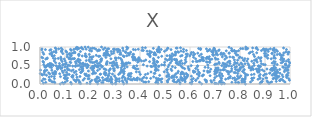
| Category | Series 0 |
|---|---|
| 0.20426082624092745 | 0.587 |
| 0.36272719815670096 | 0.861 |
| 0.8153955051735944 | 0.376 |
| 0.3729846032833899 | 0.445 |
| 0.8045086489264134 | 0.567 |
| 0.1439994279631579 | 0.341 |
| 0.8717027761930042 | 0.317 |
| 0.9951669443724769 | 0.857 |
| 0.8722146589589249 | 0.127 |
| 0.8231444333154888 | 0.943 |
| 0.8858583309482669 | 0.904 |
| 0.6836288513205269 | 0.089 |
| 0.6956370302324736 | 0.103 |
| 0.9128229049434629 | 0.879 |
| 0.7866731166661785 | 0.125 |
| 0.9286679426933921 | 0.833 |
| 0.03636047862152203 | 0.187 |
| 0.9949222020885375 | 0.144 |
| 0.10073876753924604 | 0.049 |
| 0.6173904949461092 | 0.331 |
| 0.9361999415781771 | 0.388 |
| 0.4546234243039249 | 0.195 |
| 0.7942854840604906 | 0.901 |
| 0.453441863623966 | 0.963 |
| 0.7034644494690323 | 0.384 |
| 0.08862146865692822 | 0.443 |
| 0.8657607751653718 | 0.671 |
| 0.1778056656379653 | 0.147 |
| 0.9908134551769016 | 0.229 |
| 0.5734910125883016 | 0.297 |
| 0.025885028320127956 | 0.237 |
| 0.18910464906426017 | 0.53 |
| 0.058720695203867024 | 0.268 |
| 0.9988391513887683 | 0.568 |
| 0.7531435049663163 | 0.313 |
| 0.5453642049344821 | 0.048 |
| 0.28661217034137265 | 0.567 |
| 0.6293666507666607 | 0.468 |
| 0.10953422019362935 | 0.788 |
| 0.736399254082159 | 0.455 |
| 0.6689070766604224 | 0.723 |
| 0.877908004540325 | 0.466 |
| 0.13989807700627843 | 0.843 |
| 0.8034697403553471 | 0.219 |
| 0.3613317264856879 | 0.119 |
| 0.2716113823469338 | 0.8 |
| 0.7772426047332179 | 0.908 |
| 0.230289860706544 | 0.364 |
| 0.9858885750368827 | 0.618 |
| 0.6006705914541699 | 0.023 |
| 0.8167280837820041 | 0.046 |
| 0.8890980154758239 | 0.381 |
| 0.8224665428520189 | 0.242 |
| 0.7261052932751103 | 0.146 |
| 0.9211750492984048 | 0.039 |
| 0.864371083432124 | 0.965 |
| 0.5536000208553401 | 0.111 |
| 0.766303091895723 | 0.477 |
| 0.2071403551075638 | 0.1 |
| 0.5785187022987416 | 0.197 |
| 0.5291774522851926 | 0.212 |
| 0.2635962169169568 | 0.782 |
| 0.9821509240772714 | 0.537 |
| 0.8086825867615756 | 0.53 |
| 0.8102758712557877 | 0.34 |
| 0.7366243455381281 | 0.529 |
| 0.2531722291397108 | 0.937 |
| 0.26981595716468465 | 0.948 |
| 0.5078422854178415 | 0.389 |
| 0.11728472437353166 | 0.38 |
| 0.2694240173599839 | 0.783 |
| 0.5298944465102073 | 0.179 |
| 0.2382102585453839 | 0.093 |
| 0.62244907969625 | 0.68 |
| 0.8028624765664213 | 0.956 |
| 0.9379420180453679 | 0.263 |
| 0.0810122083528747 | 0.002 |
| 0.9404600337599457 | 0.335 |
| 0.9440288562619685 | 0.248 |
| 0.18918474456399714 | 0.213 |
| 0.18152301695239692 | 0.814 |
| 0.5511701843380219 | 0.303 |
| 0.16602953981180335 | 0.97 |
| 0.7138296633233044 | 0.395 |
| 0.38416116291410807 | 0.404 |
| 0.5119570314778064 | 0.965 |
| 0.3589990521461809 | 0.819 |
| 0.02248040734097445 | 0.455 |
| 0.782787944527805 | 0.043 |
| 0.17037306247257478 | 0.416 |
| 0.32302890541042795 | 0.322 |
| 0.6132757652107951 | 0.149 |
| 0.7671430962477555 | 0.901 |
| 0.9367349539748241 | 0.771 |
| 0.328903918637116 | 0.6 |
| 0.9390570919229485 | 0.277 |
| 0.21121281889740506 | 0.579 |
| 0.6972482574754387 | 0.96 |
| 0.6987492200506394 | 0.335 |
| 0.5778197350301918 | 0.147 |
| 0.08457363760785963 | 0.652 |
| 0.0020432830335050944 | 0.375 |
| 0.739401217180128 | 0.544 |
| 0.4543857058536014 | 0.644 |
| 0.29387802545341835 | 0.583 |
| 0.16861424153614768 | 0.389 |
| 0.9874000073999551 | 0.253 |
| 0.5203910463553771 | 0.736 |
| 0.9450880229823172 | 0.916 |
| 0.09135840629216607 | 0.823 |
| 0.16371353473478523 | 0.45 |
| 0.44625596999551886 | 0.86 |
| 0.8379488037062102 | 0.445 |
| 0.36660160080648796 | 0.117 |
| 0.05054124931553772 | 0.519 |
| 0.07004184901843591 | 0.396 |
| 0.3984714322417813 | 0.13 |
| 0.05286585466638882 | 0.275 |
| 0.24626442548236527 | 0.684 |
| 0.03230455443888447 | 0.489 |
| 0.5070130685234417 | 0.379 |
| 0.7931853362486412 | 0.045 |
| 0.42846662173983563 | 0.483 |
| 0.4863749598631587 | 0.053 |
| 0.6345063372000457 | 0.961 |
| 0.6495537378866599 | 0.221 |
| 0.8796642263016647 | 0.15 |
| 0.7391998202623412 | 0.389 |
| 0.2973303675122261 | 0.549 |
| 0.10321127724795764 | 0.542 |
| 0.029147267083311723 | 0.507 |
| 0.08491017508891441 | 0.682 |
| 0.4718970721325203 | 0.018 |
| 0.34049405195712357 | 0.118 |
| 0.0896864574170767 | 0.035 |
| 0.5268406468337656 | 0.736 |
| 0.4384137567321579 | 0.828 |
| 0.6467300893166146 | 0.004 |
| 0.4402103204520892 | 0.764 |
| 0.0012947371169115263 | 0.281 |
| 0.7375912445183042 | 0.011 |
| 0.881381449106707 | 0.684 |
| 0.9009874083989451 | 0.931 |
| 0.8368346616231039 | 0.83 |
| 0.13261716964793768 | 0.38 |
| 0.6714969211813043 | 0.314 |
| 0.9345429772264244 | 0.278 |
| 0.9917687338457789 | 0.449 |
| 0.23528196132088064 | 0.493 |
| 0.04596977145695347 | 0.441 |
| 0.1025078431906482 | 0.215 |
| 0.46363222152208994 | 0.785 |
| 0.45744265631101555 | 0.806 |
| 0.47564024752365486 | 0.897 |
| 0.2875647804557574 | 0.127 |
| 0.9486080406341058 | 0.796 |
| 0.2306459618919119 | 0.007 |
| 0.08520337376985399 | 0.429 |
| 0.7167963672757596 | 0.554 |
| 0.9510649353961637 | 0.311 |
| 0.1480542360676662 | 0.182 |
| 0.4215163813903171 | 0.979 |
| 0.40119820566899056 | 0.26 |
| 0.3168165262415932 | 0.141 |
| 0.7139972592213552 | 0.902 |
| 0.6062332316873058 | 0.119 |
| 0.2650329611128587 | 0.899 |
| 0.7885413541185451 | 0.375 |
| 0.51032174629952 | 0.05 |
| 0.05764543697486646 | 0.146 |
| 0.39311373453499665 | 0.652 |
| 0.5815192118134738 | 0.654 |
| 0.1721933965001573 | 0.565 |
| 0.438152989882832 | 0.809 |
| 0.182704542981746 | 0.754 |
| 0.1565620977351455 | 0.796 |
| 0.7166259490193165 | 0.92 |
| 0.19839203905748337 | 0.617 |
| 0.4785693153477907 | 0.234 |
| 0.21443484136136948 | 0.454 |
| 0.938091676849601 | 0.396 |
| 0.04492601517536854 | 0.49 |
| 0.23865719245895756 | 0.912 |
| 0.8077638655480437 | 0.045 |
| 0.9392154291078335 | 0.233 |
| 0.13203354356826114 | 0.837 |
| 0.9680639251904615 | 0.123 |
| 0.9307343503792886 | 0.416 |
| 0.5241613252941968 | 0.402 |
| 0.680394147234449 | 0.224 |
| 0.8210393994593771 | 0.138 |
| 0.11080782466738104 | 0.387 |
| 0.3227594535843141 | 0.688 |
| 0.4868497504389193 | 0.749 |
| 0.32727324132181057 | 0.645 |
| 0.028985612871642363 | 0.704 |
| 0.16918695758305713 | 0.547 |
| 0.19706647920278675 | 0.799 |
| 0.08908796911676908 | 0.355 |
| 0.21254556123435586 | 0.74 |
| 0.12583671574990285 | 0.004 |
| 0.6788178619125795 | 0.333 |
| 0.23004643392242385 | 0.897 |
| 0.42809470955344475 | 0.888 |
| 0.8079894780572482 | 0.706 |
| 0.08929886844066193 | 0.934 |
| 0.9349350752687714 | 0.409 |
| 0.057265236243856155 | 0.766 |
| 0.9657609768777229 | 0.769 |
| 0.9729835945534653 | 0.781 |
| 0.22138345916885083 | 0.509 |
| 0.9108135810169176 | 0.052 |
| 0.7571453855427139 | 0.838 |
| 0.6559080299571 | 0.353 |
| 0.2813214126635343 | 0.411 |
| 0.16292038187066993 | 0.55 |
| 0.3694038933034278 | 0.111 |
| 0.7820069659544412 | 0.307 |
| 0.3353505026928243 | 0.53 |
| 0.37665727184385667 | 0.442 |
| 0.192959501167844 | 0.996 |
| 0.45657888795504553 | 0.611 |
| 0.3558701874518294 | 0.78 |
| 0.43123808488022775 | 0.28 |
| 0.08494730590054211 | 0.966 |
| 0.7706854030230755 | 0.723 |
| 0.42359506835227 | 0.05 |
| 0.08677458988044096 | 0.885 |
| 0.6676205136406256 | 0.713 |
| 0.5682508094975662 | 0.279 |
| 0.4699746184392396 | 0.598 |
| 0.6510035724255978 | 0.237 |
| 0.6057660741158809 | 0.851 |
| 0.936171208440344 | 0.488 |
| 0.9362556265692535 | 0.725 |
| 0.18558498391098854 | 0.747 |
| 0.12310515082170304 | 0.041 |
| 0.9394032443868113 | 0.856 |
| 0.9799674906378966 | 0.053 |
| 0.09842973614849981 | 0.161 |
| 0.2620089055709266 | 0.243 |
| 0.3751388929189067 | 0.481 |
| 0.508905180460514 | 0.085 |
| 0.18023294945812696 | 0.998 |
| 0.0499399534771201 | 0.751 |
| 0.3791380045854198 | 0.428 |
| 0.8734251827224896 | 0.484 |
| 0.5286984664390291 | 0.817 |
| 0.3082544406471913 | 0.13 |
| 0.9920679058266617 | 0.376 |
| 0.47497004385624664 | 0.994 |
| 0.3931199917037339 | 0.637 |
| 0.8668659235164714 | 0.843 |
| 0.8807666132165727 | 0.257 |
| 0.896425141647479 | 0.348 |
| 0.5113057417087165 | 0.096 |
| 0.5768870990509087 | 0.254 |
| 0.3419639466383011 | 0.558 |
| 0.5740138712299341 | 0.938 |
| 0.28448377411414394 | 0.878 |
| 0.3215787679280594 | 0.857 |
| 0.6371489536631865 | 0.631 |
| 0.32032923089676835 | 0.291 |
| 0.3405001858084 | 0.159 |
| 0.7319695607502713 | 0.564 |
| 0.5898686009530584 | 0.808 |
| 0.8832583714800242 | 0.62 |
| 0.3249566990516528 | 0.44 |
| 0.6655981573459808 | 0.093 |
| 0.9858304780624292 | 0.931 |
| 0.37993536864136357 | 0.115 |
| 0.22609160054632638 | 0.15 |
| 0.7711022381137624 | 0.153 |
| 0.6358103167709765 | 0.244 |
| 0.19824517738709824 | 0.908 |
| 0.10084685162209162 | 0.534 |
| 0.09990840605668316 | 0.467 |
| 0.6773573168856797 | 0.738 |
| 0.47472515713985886 | 0.099 |
| 0.011555716567567487 | 0.851 |
| 0.8660408566263198 | 0.984 |
| 0.9054767166310111 | 0.267 |
| 0.474117920409582 | 0.47 |
| 0.5683517901357025 | 0.771 |
| 0.32897169378199675 | 0.089 |
| 0.49724025372833813 | 0.517 |
| 0.45927880822789524 | 0.837 |
| 0.15998571553792695 | 0.204 |
| 0.7593739829180958 | 0.327 |
| 0.09708007251631345 | 0.677 |
| 0.7043491643790238 | 0.875 |
| 0.01748928820958795 | 0.265 |
| 0.29000004685441627 | 0.269 |
| 0.018456488234017354 | 0.355 |
| 0.20981636368183498 | 0.967 |
| 0.2710284507711629 | 0.161 |
| 0.2248992576885056 | 0.775 |
| 0.9424847011516664 | 0.158 |
| 0.3011384706428917 | 0.016 |
| 0.184593329495772 | 0.73 |
| 0.9687647168473578 | 0.694 |
| 0.023065317334067137 | 0.042 |
| 0.2521463105255711 | 0.03 |
| 0.24326686488832716 | 0.607 |
| 0.969267750650562 | 0.584 |
| 0.3945448865820159 | 0.615 |
| 0.12859558118037273 | 0.686 |
| 0.6346397889964022 | 0.324 |
| 0.01417654244990263 | 0.138 |
| 0.8168713114256172 | 0.392 |
| 0.7596252316662185 | 0.733 |
| 0.583197099466221 | 0.712 |
| 0.15420562381909142 | 0.8 |
| 0.5393932711820336 | 0.664 |
| 0.535807597800587 | 0.119 |
| 0.908453877123066 | 0.083 |
| 0.7889481639450913 | 0.566 |
| 0.7594488594356501 | 0.613 |
| 0.04619025106576036 | 0.206 |
| 0.44734471452241786 | 0.469 |
| 0.21665004354538941 | 0.291 |
| 0.46330757036101566 | 0.514 |
| 0.23510525273766514 | 0.17 |
| 0.9062308233953231 | 0.938 |
| 0.4214046086001928 | 0.255 |
| 0.6055044209759267 | 0.21 |
| 0.3036657669856002 | 0.646 |
| 0.1585959470023366 | 0.063 |
| 0.9560370313628218 | 0.205 |
| 0.7063644272372702 | 0.834 |
| 0.28397215981434165 | 0.127 |
| 0.4980253947897627 | 0.884 |
| 0.046613365895329606 | 0.853 |
| 0.02822613965028542 | 0.686 |
| 0.26868108972213234 | 0.092 |
| 0.9962703725989592 | 0.502 |
| 0.0200896544636755 | 0.455 |
| 0.8504853275505116 | 0.974 |
| 0.3465654816147046 | 0.076 |
| 0.9007436654336358 | 0.52 |
| 0.5296526280565605 | 0.469 |
| 0.2570990968569683 | 0.827 |
| 0.7551997729883904 | 0.168 |
| 0.051347332949236546 | 0.055 |
| 0.841455578038374 | 0.855 |
| 0.7802712066780634 | 0.451 |
| 0.13700470372356666 | 0.313 |
| 0.4636971860242297 | 0.512 |
| 0.2302775628659215 | 0.55 |
| 0.06256094666790346 | 0.575 |
| 0.014198430732694445 | 0.59 |
| 0.26866485867571865 | 0.858 |
| 0.9588104168219957 | 0.797 |
| 0.7272049085964322 | 0.002 |
| 0.2061544478597367 | 0.891 |
| 0.5695257522095508 | 0.553 |
| 0.4684814404825458 | 0.929 |
| 0.676253433226015 | 0.327 |
| 0.14466272177499684 | 0.558 |
| 0.5927035661395808 | 0.464 |
| 0.704407459936592 | 0.4 |
| 0.456981484186502 | 0.652 |
| 0.3159990297996561 | 0.915 |
| 0.6809002965666019 | 0.656 |
| 0.43840382563686775 | 0.604 |
| 0.22588481077879086 | 0.063 |
| 0.8459373146967529 | 0.252 |
| 0.30604041466172127 | 0.57 |
| 0.4560899790039462 | 0.484 |
| 0.07936626503724276 | 0.466 |
| 0.27755853285971044 | 0.288 |
| 0.24707490026591095 | 0.033 |
| 0.6065989490808291 | 0.008 |
| 0.711970872658111 | 0.437 |
| 0.9744610470010434 | 0.615 |
| 0.6307761761957774 | 0.61 |
| 0.19988545812393732 | 0.723 |
| 0.4646963885246441 | 0.158 |
| 0.14191714509666276 | 0.475 |
| 0.6478444516582659 | 0.713 |
| 0.15376117158035918 | 0.673 |
| 0.3335747542528341 | 0.198 |
| 0.27826512195578756 | 0.767 |
| 0.1089263109806351 | 0.087 |
| 0.29980645831950303 | 0.513 |
| 0.3325880177130224 | 0.047 |
| 0.8728499791190857 | 0.411 |
| 0.5103835539593453 | 0.967 |
| 0.10969764513665536 | 0.424 |
| 0.5844428979394815 | 0.809 |
| 0.640864908199048 | 0.637 |
| 0.0568935914425055 | 0.201 |
| 0.1553204743909501 | 0.961 |
| 0.25229424011980706 | 0.095 |
| 0.4306753909956903 | 0.809 |
| 0.4712468769461454 | 0.925 |
| 0.4436246937371704 | 0.478 |
| 0.8318467751030398 | 0.551 |
| 0.3939248193291073 | 0.685 |
| 0.3518711287475502 | 0.147 |
| 0.006466064222615753 | 0.924 |
| 0.48481180038158467 | 0.933 |
| 0.924830814015153 | 0.682 |
| 0.279748951341237 | 0.567 |
| 0.37431770316361745 | 0.804 |
| 0.7840422815550983 | 0.557 |
| 0.9443461906131343 | 0.313 |
| 0.8757161610599139 | 0.492 |
| 0.3470099173156461 | 0.764 |
| 0.679375428741443 | 0.933 |
| 0.5472866330707112 | 0.561 |
| 0.18481765726021337 | 0.267 |
| 0.31463823791160084 | 0.919 |
| 0.024562395591210873 | 0.476 |
| 0.8845072735510909 | 0.04 |
| 0.9937405560151178 | 0.658 |
| 0.33488732583611447 | 0.003 |
| 0.7473145273250765 | 0.346 |
| 0.05457578435853205 | 0.292 |
| 0.26365798267513185 | 0.718 |
| 0.8013608610128926 | 0.445 |
| 0.3515563889180784 | 0.976 |
| 0.5370285449091395 | 0.665 |
| 0.9597704210461385 | 0.09 |
| 0.7660287465224299 | 0.958 |
| 0.07337214603317643 | 0.469 |
| 0.20146993101728994 | 0.063 |
| 0.6657694304707963 | 0.95 |
| 0.09477180252355033 | 0.009 |
| 0.10936004980919278 | 0.469 |
| 0.8996808543108922 | 0.261 |
| 0.19243963995071178 | 0.138 |
| 0.695457769021146 | 0.967 |
| 0.09226628915792545 | 0.528 |
| 0.9035800635301651 | 0.166 |
| 0.5673697573140551 | 0.312 |
| 0.7251167387082349 | 0.836 |
| 0.7939297808261351 | 0.347 |
| 0.8228926372969217 | 0.264 |
| 0.17120805811038198 | 0.358 |
| 0.5411476880764686 | 0.443 |
| 0.6227105871434386 | 0.42 |
| 0.9066416683210102 | 0.163 |
| 0.4203303210976038 | 0.05 |
| 0.06442364142364798 | 0.949 |
| 0.039709650400051144 | 0.461 |
| 0.015095522348089085 | 0.806 |
| 0.47003341552970834 | 0.884 |
| 0.6992594932943975 | 0.169 |
| 0.06327339114669106 | 0.326 |
| 0.8489284193497505 | 0.46 |
| 0.5622545279779477 | 0.501 |
| 0.03956609611094708 | 0.814 |
| 0.08862704645607045 | 0.607 |
| 0.9877208054636859 | 0.366 |
| 0.10461721826170534 | 0.571 |
| 0.6309308755530739 | 0.155 |
| 0.8307557445307142 | 0.962 |
| 0.16261878458571755 | 0.012 |
| 0.8163658370627587 | 0.305 |
| 0.2444609856516442 | 0.659 |
| 0.5241531355454992 | 0.93 |
| 0.6522127907961502 | 0.632 |
| 0.5806394510945289 | 0.059 |
| 0.9709307784704868 | 0.638 |
| 0.3033758138181287 | 0.003 |
| 0.1879722278568593 | 0.022 |
| 0.693427982916604 | 0.788 |
| 0.1308535162450104 | 0.482 |
| 0.013555015750910893 | 0.023 |
| 0.13812422824341086 | 0.867 |
| 0.5718445090263268 | 0.436 |
| 0.4766020361574057 | 0.94 |
| 0.061018017841993344 | 0.684 |
| 0.5437429590511504 | 0.276 |
| 0.6303100749555192 | 0.494 |
| 0.932441615161987 | 0.141 |
| 0.19632354208822012 | 0.656 |
| 0.4557711734934117 | 0.797 |
| 0.8765001430850708 | 0.217 |
| 0.9220824252134225 | 0.388 |
| 0.8309268377944239 | 0.245 |
| 0.6189112443693658 | 0.808 |
| 0.8474847007029305 | 0.151 |
| 0.5197954411267353 | 0.683 |
| 0.703966373760818 | 0.8 |
| 0.8565176419515373 | 0.265 |
| 0.15540300142060415 | 0.767 |
| 0.5469065270417945 | 0.624 |
| 0.06410192118651614 | 0.895 |
| 0.1325084659663236 | 0.219 |
| 0.46140048383209087 | 0.371 |
| 0.9904694796470415 | 0.384 |
| 0.4601088098833448 | 0.822 |
| 0.31082777348556867 | 0.867 |
| 0.30522770109259345 | 0.931 |
| 0.5639885568159662 | 0.889 |
| 0.08196503792780874 | 0.199 |
| 0.7043358968642804 | 0.013 |
| 0.14392300581092432 | 0.066 |
| 0.1820501945670675 | 0.496 |
| 0.7442497529413366 | 0.47 |
| 0.2657996756755838 | 0.105 |
| 0.9748557956643837 | 0.45 |
| 0.3468507598189753 | 0.996 |
| 0.7518277660546295 | 0.34 |
| 0.3733791252779325 | 0.934 |
| 0.7596161101037795 | 0.166 |
| 0.216819633199405 | 0.489 |
| 0.8743898490281056 | 0.716 |
| 0.3475299151544078 | 0.938 |
| 0.5786745976359775 | 0.557 |
| 0.7995920887262412 | 0.412 |
| 0.5086908102517066 | 0.383 |
| 0.6377136803622551 | 0.762 |
| 0.3273101474759377 | 0.553 |
| 0.578369958767724 | 0.121 |
| 0.9978527813160033 | 0.103 |
| 0.8216189022833787 | 0.189 |
| 0.6644832022630008 | 0.07 |
| 0.11719053958002346 | 0.708 |
| 0.26371199796718403 | 0.809 |
| 0.4231575953461152 | 0.648 |
| 0.3317082478898482 | 0.559 |
| 0.7991002491088242 | 0.729 |
| 0.540340299803426 | 0.792 |
| 0.7791659855876351 | 0.887 |
| 0.37680578951271015 | 0.681 |
| 0.20970252308538895 | 0.382 |
| 0.9644936253385915 | 0.572 |
| 0.8940855577504401 | 0.23 |
| 0.2464452301443799 | 0.459 |
| 0.8800145659117736 | 0.172 |
| 0.8863882881664555 | 0.05 |
| 0.858136655588451 | 0.743 |
| 0.515561201348522 | 0.515 |
| 0.46208719475433624 | 0.398 |
| 0.11688905705376784 | 0.812 |
| 0.3325286879307279 | 0.214 |
| 0.5787859669699013 | 0.101 |
| 0.9438361841556673 | 0.292 |
| 0.8855302659861458 | 0.549 |
| 0.8230325743517664 | 0.997 |
| 0.5623941543970058 | 0.754 |
| 0.5381870438767254 | 0.235 |
| 0.16601018328046813 | 0.989 |
| 0.2861278523852011 | 0.041 |
| 0.347224759055487 | 0.025 |
| 0.9496916603126861 | 0.884 |
| 0.2338359172759905 | 0.911 |
| 0.6906283120137467 | 0.799 |
| 0.12482016883495273 | 0.908 |
| 0.6702615923053019 | 0.35 |
| 0.9215143747658617 | 0.952 |
| 0.16165853020287324 | 0.877 |
| 0.2981756702372724 | 0.216 |
| 0.5258080050787739 | 0.177 |
| 0.670639018293984 | 0.698 |
| 0.05711004528162611 | 0.625 |
| 0.6249462732934612 | 0.608 |
| 0.9277943046694374 | 0.823 |
| 0.04684155325518613 | 0.518 |
| 0.12546514899693695 | 0.818 |
| 0.27485098894532 | 0.228 |
| 0.9110434401165222 | 0.696 |
| 0.9658451906472248 | 0.763 |
| 0.5903723064027617 | 0.221 |
| 0.09780854229775937 | 0.157 |
| 0.35324338288235635 | 0.574 |
| 0.6136469464313995 | 0.777 |
| 0.8522106534557611 | 0.4 |
| 0.23178407233084763 | 0.068 |
| 0.062078195785852164 | 0.273 |
| 0.7776672172081883 | 0.652 |
| 0.9790957057770394 | 0.376 |
| 0.6199787495047786 | 0.331 |
| 0.3363776126302538 | 0.741 |
| 0.5602186744030209 | 0.032 |
| 0.21441903279053454 | 0.349 |
| 0.6928894395682054 | 0.915 |
| 0.3066063283917877 | 0.507 |
| 0.8564555479283187 | 0.502 |
| 0.14271971840745834 | 0.958 |
| 0.07936999717300341 | 0.494 |
| 0.4134288063584255 | 0.521 |
| 0.5269543590460509 | 0.672 |
| 0.9851167176779961 | 0.507 |
| 0.13513834317303774 | 0.935 |
| 0.6992384554127247 | 0.015 |
| 0.2938205515513278 | 0.414 |
| 0.18454819231425668 | 0.942 |
| 0.04720174210735861 | 0.373 |
| 0.5620601587052249 | 0.978 |
| 0.09099548313332517 | 0.515 |
| 0.037659121539717844 | 0.116 |
| 0.1492831120470246 | 0.936 |
| 0.9602808886553285 | 0.289 |
| 0.7177175734723504 | 0.241 |
| 0.4158924407639356 | 0.621 |
| 0.6500866711725475 | 0.665 |
| 0.9448635423404214 | 0.13 |
| 0.9504226911084956 | 0.174 |
| 0.7038267954854284 | 0.669 |
| 0.18510474791884546 | 0.632 |
| 0.7188072095131992 | 0.068 |
| 0.3146516776298385 | 0.707 |
| 0.8939435389429804 | 0.943 |
| 0.7982702263489648 | 0.179 |
| 0.36487128423113924 | 0.285 |
| 0.8554831600917963 | 0.166 |
| 0.6310217869644013 | 0.383 |
| 0.8129143513113731 | 0.643 |
| 0.6646567455762276 | 0.688 |
| 0.5496873901570113 | 0.553 |
| 0.33072434501039016 | 0.969 |
| 0.5022583572252253 | 0.673 |
| 0.5507244371537914 | 0.076 |
| 0.38700082561854077 | 0.492 |
| 0.5433665554512 | 0.837 |
| 0.02298145864904544 | 0.673 |
| 0.26725092929311844 | 0.88 |
| 0.519251153065478 | 0.771 |
| 0.17191394846636188 | 0.942 |
| 0.2062814544485173 | 0.726 |
| 0.45736065057137265 | 0.845 |
| 0.6913470990447471 | 0.866 |
| 0.29697379791845435 | 0.94 |
| 0.4716922648539572 | 0.118 |
| 0.04085611938758338 | 0.522 |
| 0.1412684217614134 | 0.084 |
| 0.35605839605029443 | 0.218 |
| 0.7675953212734139 | 0.044 |
| 0.2899118780897214 | 0.499 |
| 0.38533470235325473 | 0.328 |
| 0.38854652989422445 | 0.106 |
| 0.193549941703673 | 0.35 |
| 0.6553804250012125 | 0.634 |
| 0.9830871563900571 | 0.432 |
| 0.2908837190141548 | 0.482 |
| 0.6747519111918551 | 0.906 |
| 0.9930929654274524 | 0.3 |
| 0.24334659369553313 | 0.66 |
| 0.32531762476069437 | 0.378 |
| 0.25022515362666975 | 0.171 |
| 0.05069194059077575 | 0.301 |
| 0.7860606143879825 | 0.878 |
| 0.590301444214794 | 0.251 |
| 0.5443435902315228 | 0.634 |
| 0.27562230909470287 | 0.08 |
| 0.2651025748667163 | 0.138 |
| 0.7070400733357721 | 0.323 |
| 0.7612626456820932 | 0.206 |
| 0.948617607477532 | 0.527 |
| 0.06478933889483973 | 0.492 |
| 0.47880975000366033 | 0.862 |
| 0.6366966198652242 | 0.216 |
| 0.2591532778551432 | 0.114 |
| 0.2858491683251537 | 0.024 |
| 0.2299902381585225 | 0.474 |
| 0.7116976389886992 | 0.669 |
| 0.05992076750180131 | 0.337 |
| 0.525292402880356 | 0.753 |
| 0.15098594749160477 | 0.496 |
| 0.9337655798889366 | 0.405 |
| 0.7114628715629158 | 0.364 |
| 0.7799922853550748 | 0.104 |
| 0.7039282563832434 | 0.433 |
| 0.12228663674618567 | 0.766 |
| 0.748352555681723 | 0.507 |
| 0.09909400616866038 | 0.37 |
| 0.8709339760727003 | 0.931 |
| 0.4161470316814657 | 0.183 |
| 0.9339957032649763 | 0.427 |
| 0.31849406053007345 | 0.914 |
| 0.5855228764914858 | 0.173 |
| 0.259283076842725 | 0.776 |
| 0.255020926053817 | 0.779 |
| 0.008095409797783337 | 0.088 |
| 0.14721714651709628 | 0.115 |
| 0.10541268971136786 | 0.132 |
| 0.7562831567982237 | 0.992 |
| 0.23090458468818775 | 0.456 |
| 0.776617322416113 | 0.31 |
| 0.5678010840873633 | 0.322 |
| 0.181254905947143 | 0.76 |
| 0.05658065736859974 | 0.061 |
| 0.6601173593025221 | 0.115 |
| 0.3867552170539166 | 0.146 |
| 0.7293817738351213 | 0.733 |
| 0.3917910161231768 | 0.406 |
| 0.3317659338215668 | 0.38 |
| 0.037924944072270206 | 0.094 |
| 0.044050834896733115 | 0.55 |
| 0.6421538288732431 | 0.933 |
| 0.7858934993899251 | 0.784 |
| 0.12032422679843913 | 0.591 |
| 0.10698723412175615 | 0.859 |
| 0.6540063150937179 | 0.246 |
| 0.6916004150386978 | 0.852 |
| 0.3599121427332749 | 0.279 |
| 0.7076867145395146 | 0.542 |
| 0.6146367196234506 | 0.315 |
| 0.16604829993599746 | 0.471 |
| 0.12530533007313138 | 0.768 |
| 0.03474480502003052 | 0.301 |
| 0.256753955141265 | 0.278 |
| 0.2355386184195507 | 0.922 |
| 0.19531217262277867 | 0.23 |
| 0.942866180571502 | 0.246 |
| 0.24075881037229774 | 0.263 |
| 0.48211215110422445 | 0.11 |
| 0.8278460007979931 | 0.618 |
| 0.19342081177365456 | 0.5 |
| 0.3594797529872815 | 0.564 |
| 0.05363400375245586 | 0.503 |
| 0.166840982592244 | 0.333 |
| 0.7917482505570481 | 0.381 |
| 0.38476433504476115 | 0.647 |
| 0.39958089996737267 | 0.661 |
| 0.5568338861001821 | 0.087 |
| 0.14835425870190888 | 0.631 |
| 0.5673210759615321 | 0.161 |
| 0.7360823297297742 | 0.536 |
| 0.6726157603108296 | 0.445 |
| 0.2605264984875947 | 0.828 |
| 0.34693628663757314 | 0.566 |
| 0.7542512951191535 | 0.267 |
| 0.8543646204917316 | 0.796 |
| 0.22713113474502922 | 0.62 |
| 0.6048724873870204 | 0.496 |
| 0.6381056330865892 | 0.296 |
| 0.7157564511409074 | 0.584 |
| 0.30121251992586007 | 0.702 |
| 0.45705436340546846 | 0.573 |
| 0.40701940882640564 | 0.094 |
| 0.3751054637376978 | 0.15 |
| 0.09648727990975614 | 0.239 |
| 0.22330119152543704 | 0.072 |
| 0.5159328674413151 | 0.205 |
| 0.7240380875724001 | 0.808 |
| 0.055458457634915526 | 0.873 |
| 0.14184535394674758 | 0.599 |
| 0.12592332932652328 | 0.355 |
| 0.4986025978054306 | 0.587 |
| 0.7231757041714006 | 0.807 |
| 0.9750658168872932 | 0.672 |
| 0.22311456589377543 | 0.944 |
| 0.2003196545946735 | 0.011 |
| 0.11959740347155268 | 0.823 |
| 0.35300276874630576 | 0.236 |
| 0.08688985208394207 | 0.904 |
| 0.01742208691800118 | 0.32 |
| 0.796998627850437 | 0.707 |
| 0.8215458290682186 | 0 |
| 0.3382306112843646 | 0.423 |
| 0.7791549237599792 | 0.586 |
| 0.3816760782056161 | 0.925 |
| 0.2794021087585734 | 0.393 |
| 0.15307416109388694 | 0.608 |
| 0.692787761244323 | 0.773 |
| 0.5537498221504743 | 0.527 |
| 0.16401553593144247 | 0.317 |
| 0.25992172703883254 | 0.975 |
| 0.15795032181446889 | 0.579 |
| 0.9035550862739332 | 0.824 |
| 0.039189384219828205 | 0.272 |
| 0.6534681017485909 | 0.71 |
| 0.15413679464543295 | 0.105 |
| 0.8165260603606047 | 0.632 |
| 0.46309350935089144 | 0.038 |
| 0.8198624978827003 | 0.547 |
| 0.5634950919937117 | 0.259 |
| 0.5649037878123342 | 0.627 |
| 0.08314533630437315 | 0.725 |
| 0.040670593190558435 | 0.11 |
| 0.5171289073633141 | 0.659 |
| 0.03933818827646751 | 0.554 |
| 0.006195845513000675 | 0.261 |
| 0.9627068335479315 | 0.125 |
| 0.0729458620635628 | 0.692 |
| 0.5544683428336084 | 0.858 |
| 0.3034419138235779 | 0.167 |
| 0.44270889958904935 | 0.153 |
| 0.7014163981167668 | 0.37 |
| 0.2865389047183763 | 0.814 |
| 0.2652638921880315 | 0.538 |
| 0.8438047152162245 | 0.375 |
| 0.5091495057072216 | 0.64 |
| 0.8577438196987416 | 0.642 |
| 0.3145569519438065 | 0.26 |
| 0.5673426546344077 | 0.461 |
| 0.9183572698686018 | 0.29 |
| 0.7131235053805716 | 0.01 |
| 0.3725825298930544 | 0.651 |
| 0.13048592535564985 | 0.229 |
| 0.3417037318397995 | 0.869 |
| 0.46747941080346356 | 0.608 |
| 0.7813414429030502 | 0.829 |
| 0.6712665911982617 | 0.517 |
| 0.608976049690712 | 0.067 |
| 0.10981519875764112 | 0.16 |
| 0.3194931026076422 | 0.294 |
| 0.685891023949466 | 0.88 |
| 0.30330897284183567 | 0.102 |
| 0.22956240497447444 | 0.152 |
| 0.33264335824939306 | 0.905 |
| 0.5945291038240862 | 0.413 |
| 0.9817035990429425 | 0.534 |
| 0.4081630288535122 | 0.907 |
| 0.07466270712843925 | 0.949 |
| 0.8996353315904575 | 0.758 |
| 0.9363572322665835 | 0.966 |
| 0.7715851229248891 | 0.89 |
| 0.47154642437825967 | 0.142 |
| 0.39696530680552855 | 0.321 |
| 0.1958178586495506 | 0.147 |
| 0.7525398510028689 | 0.151 |
| 0.29001354386887834 | 0.008 |
| 0.9746595498883797 | 0.838 |
| 0.48792942404635664 | 0.14 |
| 0.7932364476382255 | 0.16 |
| 0.7904680781471831 | 0.643 |
| 0.06099586740649254 | 0.973 |
| 0.20711553619457712 | 0.668 |
| 0.059375700802825615 | 0.03 |
| 0.9939580175410113 | 0.854 |
| 0.12202464931298074 | 0.936 |
| 0.8976351770554881 | 0.824 |
| 0.8689129800091676 | 0.351 |
| 0.10022664816933358 | 0.625 |
| 0.45690671347169753 | 0.287 |
| 0.6990379441649479 | 0.271 |
| 0.2722465547447759 | 0.802 |
| 0.0920673591787835 | 0.311 |
| 0.07761808961551164 | 0.553 |
| 0.29410071364463397 | 0.599 |
| 0.7965423846989927 | 0.521 |
| 0.7252087303200132 | 0.097 |
| 0.8075120803886497 | 0.091 |
| 0.5675784648267159 | 0.104 |
| 0.12715336824010393 | 0.198 |
| 0.32897332338020135 | 0.171 |
| 0.974287231591044 | 0.974 |
| 0.7505896777721395 | 0.586 |
| 0.5856166297274839 | 0.906 |
| 0.7568663881186727 | 0.614 |
| 0.0198771802626313 | 0.127 |
| 0.9333281170791519 | 0.908 |
| 0.05374875510302091 | 0.695 |
| 0.2788001839121026 | 0.118 |
| 0.9589817908962035 | 0.821 |
| 0.30820007498654656 | 0.51 |
| 0.9453240266587835 | 0.219 |
| 0.4385954438497829 | 0.886 |
| 0.9354593396850867 | 0.701 |
| 0.5162194613904314 | 0.14 |
| 0.6131531330619605 | 0.352 |
| 0.2688791395101695 | 0.884 |
| 0.039035054221068455 | 0.913 |
| 0.6682051849466412 | 0.596 |
| 0.10251447408595171 | 0.238 |
| 0.10914821814589282 | 0.734 |
| 0.043693696276168814 | 0.928 |
| 0.35404667885505037 | 0.144 |
| 0.15365477672168615 | 0.962 |
| 0.7252896327308582 | 0.012 |
| 0.7325929607833073 | 0.39 |
| 0.8994180979597842 | 0.89 |
| 0.8892570649054778 | 0.073 |
| 0.6829421110080333 | 0.399 |
| 0.26869988121594335 | 0.605 |
| 0.04728878884484844 | 0.816 |
| 0.16294357341859078 | 0.31 |
| 0.9938531287288485 | 0.467 |
| 0.335691523844887 | 0.279 |
| 0.7037439623152851 | 0.539 |
| 0.01917649647994968 | 0.364 |
| 0.11224614352080775 | 0.514 |
| 0.3931068507332862 | 0.94 |
| 0.21330463883722717 | 0.416 |
| 0.12053557612888999 | 0.693 |
| 0.380859744684368 | 0.68 |
| 0.29622661305532605 | 0.355 |
| 0.13525941110716555 | 0.682 |
| 0.45269146884111167 | 0.557 |
| 0.6487959065530435 | 0.717 |
| 0.5265868813451434 | 0.623 |
| 0.718572383951487 | 0.301 |
| 0.4968005222318024 | 0.512 |
| 0.22858614982679315 | 0.191 |
| 0.9921144989358528 | 0.806 |
| 0.15281438642782696 | 0.658 |
| 0.9860754287252933 | 0.218 |
| 0.44402992290733967 | 0.325 |
| 0.042491123672097286 | 0.496 |
| 0.047673972633530015 | 0.773 |
| 0.8075590712864164 | 0.449 |
| 0.45975067860054675 | 0.288 |
| 0.864814521313903 | 0.632 |
| 0.7670185632632917 | 0.907 |
| 0.390029586172681 | 0.166 |
| 0.7428180637804267 | 0.534 |
| 0.9586768191070117 | 0.393 |
| 0.02170874937092704 | 0.93 |
| 0.20376342867315356 | 0.433 |
| 0.259548842006064 | 0.405 |
| 0.5365058829777354 | 0.192 |
| 0.5450262488551907 | 0.97 |
| 0.9351561946397214 | 0.161 |
| 0.8187856508415416 | 0.07 |
| 0.8472367174317291 | 0.615 |
| 0.9205681695499968 | 0.299 |
| 0.37815303083438734 | 0.708 |
| 0.8498250758438631 | 0.873 |
| 0.7451534139439268 | 0.896 |
| 0.7418142452945412 | 0.76 |
| 0.17268791818711537 | 0.475 |
| 0.2393008451355152 | 0.101 |
| 0.5081038259727598 | 0.765 |
| 0.7741805730481374 | 0.719 |
| 0.45385747094975915 | 0.689 |
| 0.06843686809089233 | 0.431 |
| 0.5577261831594644 | 0.597 |
| 0.8550529108441942 | 0.559 |
| 0.880270642785818 | 0.017 |
| 0.17364944516129588 | 0.535 |
| 0.46623215484645253 | 0.077 |
| 0.6436236839308027 | 0.643 |
| 0.8843609959675504 | 0.712 |
| 0.6876075068165934 | 0.671 |
| 0.0856787993237752 | 0.876 |
| 0.9926978621433006 | 0.851 |
| 0.7600346339531308 | 0.553 |
| 0.5413726444281269 | 0.782 |
| 0.6869946651453959 | 0.046 |
| 0.5839708869417343 | 0.6 |
| 0.9491969618885189 | 0.209 |
| 0.9823173505578233 | 0.515 |
| 0.7049259552608288 | 0.295 |
| 0.5076698613418313 | 0.199 |
| 0.43796495051383066 | 0.771 |
| 0.7557325304278415 | 0.49 |
| 0.9628675005800109 | 0.661 |
| 0.011848415511778732 | 0.61 |
| 0.15776577370870948 | 0.388 |
| 0.20996512793843025 | 0.279 |
| 0.611417981933999 | 0.607 |
| 0.015212713204487693 | 0.527 |
| 0.3310959069982964 | 0.331 |
| 0.9130647515160085 | 0.924 |
| 0.3455695078255341 | 0.535 |
| 0.7469202641312628 | 0.714 |
| 0.8532726432836714 | 0.396 |
| 0.1356962884325732 | 0.116 |
| 0.5369256326031128 | 0.063 |
| 0.26719206009920726 | 0.537 |
| 0.9717272923253788 | 0.195 |
| 0.14634968861421427 | 0.989 |
| 0.3953962698938861 | 0.713 |
| 0.6454782299924035 | 0.805 |
| 0.2140081355543505 | 0.424 |
| 0.5322385279168047 | 0.083 |
| 0.6229265306909817 | 0.094 |
| 0.3370092223843676 | 0.338 |
| 0.8113916950777742 | 0.957 |
| 0.4102214476744719 | 0.15 |
| 0.7227641330417055 | 0.371 |
| 0.15697740414225825 | 0.503 |
| 0.24538207721399086 | 0.638 |
| 0.9425393943359438 | 0.437 |
| 0.5505924428583081 | 0.872 |
| 0.5126056954563023 | 0.463 |
| 0.5632904098950838 | 0.141 |
| 0.006483134900326926 | 0.722 |
| 0.342793755572241 | 0.851 |
| 0.8092613801690617 | 0.138 |
| 0.3630449972789558 | 0.203 |
| 0.5465021815344774 | 0.184 |
| 0.7304257116909367 | 0.79 |
| 0.22502971034352182 | 0.477 |
| 0.10358380865360861 | 0.891 |
| 0.47582720673329715 | 0.487 |
| 0.47279095934834126 | 0.375 |
| 0.3713210799702287 | 0.794 |
| 0.42627702028920045 | 0.162 |
| 0.6232114209845925 | 0.106 |
| 0.07289151329398413 | 0.434 |
| 0.18155735036923082 | 0.538 |
| 0.9320537064990935 | 0.932 |
| 0.31719912463917144 | 0.071 |
| 0.3379070116112982 | 0.488 |
| 0.22419318423250068 | 0.604 |
| 0.7757158155591104 | 0.524 |
| 0.23851567715599675 | 0.405 |
| 0.24251796066863196 | 0.266 |
| 0.5418239331622157 | 0.865 |
| 0.7008422646866593 | 0.704 |
| 0.8372634883013873 | 0.441 |
| 0.9660144202173011 | 0.714 |
| 0.8274193242327298 | 0.943 |
| 0.8150090105288831 | 0.115 |
| 0.9483384324022059 | 0.377 |
| 0.2373589623977903 | 0.562 |
| 0.3910454243578235 | 0.59 |
| 0.6661190577396905 | 0.596 |
| 0.024080773841760328 | 0.472 |
| 0.9368000938604654 | 0.928 |
| 0.9077825531262785 | 0.405 |
| 0.6986512096534316 | 0.524 |
| 0.7668607742618457 | 0.41 |
| 0.5649067293103451 | 0.294 |
| 0.046436145997990286 | 0.067 |
| 0.61418913281436 | 0.722 |
| 0.9110955171374093 | 0.779 |
| 0.29670436222953367 | 0.375 |
| 0.3794901729042053 | 0.663 |
| 0.8478400692722668 | 0.15 |
| 0.508382485741182 | 0.225 |
| 0.7299443792877299 | 0.217 |
| 0.12308337340885378 | 0.577 |
| 0.2713838251801892 | 0.227 |
| 0.07871300054303021 | 0.276 |
| 0.676859921175896 | 0.677 |
| 0.9777100862191046 | 0.333 |
| 0.5631088266819324 | 0.185 |
| 0.7862072494161311 | 0.468 |
| 0.1902098739724558 | 0.461 |
| 0.70663967560078 | 0.212 |
| 0.8942958872711132 | 0.94 |
| 0.7219186561289953 | 0.045 |
| 0.9450674208998872 | 0.07 |
| 0.20265480731071528 | 0.957 |
| 0.5269181296074206 | 0.363 |
| 0.5444866087681228 | 0.57 |
| 0.4969923534673366 | 0.33 |
| 0.9268271554605034 | 0.057 |
| 0.7559383037385944 | 0.832 |
| 0.41449520945125884 | 0.056 |
| 0.8314141249737078 | 0.677 |
| 0.18255204734465147 | 0.234 |
| 0.9866547520909121 | 0.175 |
| 0.31153786206205314 | 0.45 |
| 0.25603923926259275 | 0.409 |
| 0.669736351157786 | 0.888 |
| 0.631090176857284 | 0.833 |
| 0.9286157922208467 | 0.363 |
| 0.8377241437332626 | 0.457 |
| 0.26436259137731666 | 0.383 |
| 0.460578921584495 | 0.536 |
| 0.1943343343924766 | 0.224 |
| 0.7820555948335848 | 0.396 |
| 0.1504747425955425 | 0.982 |
| 0.8183125460238614 | 0.131 |
| 0.2428981306189647 | 0.506 |
| 0.4404006667330267 | 0.737 |
| 0.2588095515351927 | 0.32 |
| 0.2759242634819452 | 0.358 |
| 0.6795238111460015 | 0.585 |
| 0.3696852708210766 | 0.734 |
| 0.9708214914268817 | 0.459 |
| 0.21733314662328151 | 0.584 |
| 0.7426070782984168 | 0.13 |
| 0.3240333058515358 | 0.801 |
| 0.17057390195398714 | 0.408 |
| 0.9738897791119435 | 0.087 |
| 0.3551551724894737 | 0.274 |
| 0.08286584951784282 | 0.417 |
| 0.5532185538043918 | 0.343 |
| 0.8001136681153136 | 0.39 |
| 0.7908706544140315 | 0.282 |
| 0.9383041791651086 | 0.545 |
| 0.7185850144950201 | 0.215 |
| 0.0638512098562769 | 0.852 |
| 0.94077310832814 | 0.598 |
| 0.4798920084275268 | 0.123 |
| 0.3295189426722991 | 0.486 |
| 0.24978610760681486 | 0.471 |
| 0.5217875482603807 | 0.57 |
| 0.34863549555474127 | 0.462 |
| 0.15731580050456417 | 0.024 |
| 0.6287462353549139 | 0.27 |
| 0.9262396691584048 | 0.418 |
| 0.2137716883816403 | 0.298 |
| 0.12419611882289416 | 0.666 |
| 0.8353485505547785 | 0.51 |
| 0.6134457748069816 | 0.85 |
| 0.022840291177655847 | 0.472 |
| 0.5461582935878321 | 0.66 |
| 0.6038264179880382 | 0.808 |
| 0.7944176934169227 | 0.031 |
| 0.28427995137927153 | 0.185 |
| 0.9162180046593614 | 0.014 |
| 0.46597047819850523 | 0.404 |
| 0.17930088199733318 | 0.27 |
| 0.5604910318554789 | 0.566 |
| 0.30601110413704236 | 0.072 |
| 0.23418223082097922 | 0.747 |
| 0.28372558775226264 | 0.682 |
| 0.03274760046278302 | 0.53 |
| 0.5060406167203932 | 0.916 |
| 0.17236533721344738 | 0.105 |
| 0.007896296106705059 | 0.949 |
| 0.710300915684711 | 0.788 |
| 0.46810377689187976 | 0.112 |
| 0.9497906415175202 | 0.338 |
| 0.6656331266892752 | 0.053 |
| 0.9287956042375799 | 0.238 |
| 0.7329347783772512 | 0.822 |
| 0.24609444095397792 | 0.998 |
| 0.6396787771619865 | 0.619 |
| 0.5964372930405005 | 0.38 |
| 0.8774284041435649 | 0.362 |
| 0.3776920612596122 | 0.726 |
| 0.9026992346926302 | 0.905 |
| 0.7265830229415802 | 0.271 |
| 0.7900795070391335 | 0.214 |
| 0.14254279929087865 | 0.498 |
| 0.11024129556461526 | 0.259 |
| 0.5689220844929591 | 0.139 |
| 0.4630080859833565 | 0.451 |
| 0.11647887237353449 | 0.679 |
| 0.35229464808699273 | 0.829 |
| 0.9583591565816711 | 0.097 |
| 0.819579862772823 | 0.686 |
| 0.30499233958672756 | 0.699 |
| 0.8422956338120565 | 0.054 |
| 0.27490114639379704 | 0.953 |
| 0.995462897629804 | 0.604 |
| 0.26410108322110537 | 0.29 |
| 0.5707673199606749 | 0.098 |
| 0.7005975769770522 | 0.91 |
| 0.7395085846073882 | 0.67 |
| 0.8687477601201749 | 0.593 |
| 0.14545632951933085 | 0.258 |
| 0.019311654304791648 | 0.475 |
| 0.660314632461451 | 0.452 |
| 0.5484904504730611 | 0.97 |
| 0.22232684777973544 | 0.294 |
| 0.37127104718452575 | 0.706 |
| 0.11678480961344118 | 0.257 |
| 0.00988710056100306 | 0.244 |
| 0.8841895092995523 | 0.055 |
| 0.587225504760374 | 0.752 |
| 0.28567646625720855 | 0.079 |
| 0.13032360738184134 | 0.18 |
| 0.4133758795357746 | 0.907 |
| 0.6776713893268275 | 0.596 |
| 0.2946970187493283 | 0.886 |
| 0.48685351489083684 | 0.518 |
| 0.8916584009392841 | 0.135 |
| 0.9830372320162989 | 0.865 |
| 0.8775547197146566 | 0.397 |
| 0.23922793986637492 | 0.75 |
| 0.5881760599839729 | 0.19 |
| 0.6426100257218246 | 0.956 |
| 0.29415486653048817 | 0.835 |
| 0.8937464758371094 | 0.529 |
| 0.876009618283688 | 0.329 |
| 0.1607131061142848 | 0.642 |
| 0.8648352869021563 | 0.404 |
| 0.5601932275796546 | 0.006 |
| 0.20941375076716207 | 0.475 |
| 0.4097621150833657 | 0.98 |
| 0.5990258445065733 | 0.76 |
| 0.5785935901736179 | 0.414 |
| 0.02699159398238249 | 0.372 |
| 0.7783664683369309 | 0.164 |
| 0.16896500320719188 | 0.757 |
| 0.9410688089323501 | 0.695 |
| 0.790819068410772 | 0.783 |
| 0.5847427031897833 | 0.283 |
| 0.5093667582489958 | 0.313 |
| 0.9287756119347804 | 0.564 |
| 0.38227757060754763 | 0.644 |
| 0.7315038008178011 | 0.037 |
| 0.47360929305729493 | 0.718 |
| 0.47484297594368075 | 0.14 |
| 0.31176741406624253 | 0.94 |
| 0.7235823814771419 | 0.163 |
| 0.31959978079306206 | 0.805 |
| 0.3079135511142047 | 0.462 |
| 0.4061517566693399 | 0.623 |
| 0.9046528643403724 | 0.742 |
| 0.3333141563449873 | 0.756 |
| 0.13805657238532 | 0.688 |
| 0.514732980996352 | 0.257 |
| 0.010910821344936927 | 0.706 |
| 0.2198587290946571 | 0.116 |
| 0.18805822961788288 | 0.438 |
| 0.8498616248147369 | 0.1 |
| 0.7274085411686889 | 0.497 |
| 0.5351330957858945 | 0.777 |
| 0.7334427048388177 | 0.383 |
| 0.5740363942522588 | 0.873 |
| 0.8135832072077795 | 0.473 |
| 0.7661936647814801 | 0.353 |
| 0.8451704099154936 | 0.418 |
| 0.9690770959578142 | 0.246 |
| 0.4696364269040526 | 0.594 |
| 0.47197175799731117 | 0.866 |
| 0.5824020633881322 | 0.147 |
| 0.10652190222757618 | 0.316 |
| 0.6380722567631962 | 0.049 |
| 0.29361361643368344 | 0.941 |
| 0.7361210142075656 | 0.82 |
| 0.9354929212803923 | 0.606 |
| 0.11948548337413256 | 0.498 |
| 0.266997476276856 | 0.573 |
| 0.21665271810789188 | 0.965 |
| 0.46388496743332697 | 0.362 |
| 0.43480227900720037 | 0.062 |
| 0.29673195872837776 | 0.412 |
| 0.8820508994709226 | 0.473 |